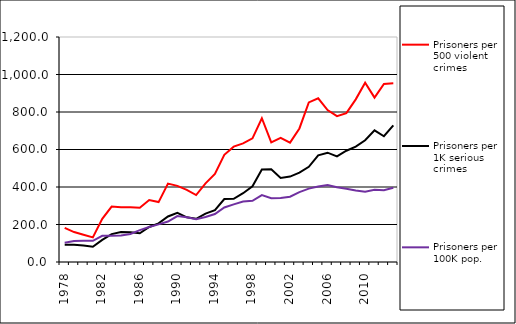
| Category | Prisoners per 500 violent crimes | Prisoners per 1K serious crimes | Prisoners per 100K pop. |
|---|---|---|---|
| 1978.0 | 182.086 | 91.466 | 102.123 |
| 1979.0 | 159.595 | 92.206 | 112 |
| 1980.0 | 145.03 | 87.843 | 113.87 |
| 1981.0 | 131.38 | 81.239 | 113.008 |
| 1982.0 | 229.862 | 117.805 | 139.841 |
| 1983.0 | 295.734 | 148.813 | 140.272 |
| 1984.0 | 292.643 | 160.319 | 141.683 |
| 1985.0 | 291.507 | 158.026 | 149.705 |
| 1986.0 | 289.704 | 152.931 | 169.822 |
| 1987.0 | 330.209 | 186.824 | 186.939 |
| 1988.0 | 319.473 | 206.242 | 200.637 |
| 1989.0 | 418.093 | 242.668 | 216 |
| 1990.0 | 405.999 | 262.473 | 244.715 |
| 1991.0 | 385.074 | 238.343 | 238.913 |
| 1992.0 | 356.951 | 230.286 | 228.112 |
| 1993.0 | 419.331 | 258.242 | 240 |
| 1994.0 | 469.16 | 276.969 | 255.672 |
| 1995.0 | 571.721 | 335.498 | 290.625 |
| 1996.0 | 615.321 | 337.058 | 307.277 |
| 1997.0 | 632.245 | 366.801 | 322.708 |
| 1998.0 | 659.53 | 404.168 | 326.611 |
| 1999.0 | 766.816 | 493.649 | 356.546 |
| 2000.0 | 638.298 | 494.991 | 340.231 |
| 2001.0 | 661.95 | 448.708 | 341.061 |
| 2002.0 | 636.73 | 455.666 | 348.215 |
| 2003.0 | 712.329 | 476.943 | 372.826 |
| 2004.0 | 851.247 | 507.562 | 391.392 |
| 2005.0 | 873.294 | 568.927 | 402.321 |
| 2006.0 | 810.583 | 583.012 | 410.482 |
| 2007.0 | 777.612 | 562.939 | 398.6 |
| 2008.0 | 794.207 | 593.394 | 391.008 |
| 2009.0 | 867.475 | 615.362 | 381.245 |
| 2010.0 | 956.522 | 649.247 | 374.717 |
| 2011.0 | 876.707 | 702.155 | 384.767 |
| 2012.0 | 949.182 | 670.724 | 382.223 |
| 2013.0 | 952.97 | 729.167 | 396.075 |